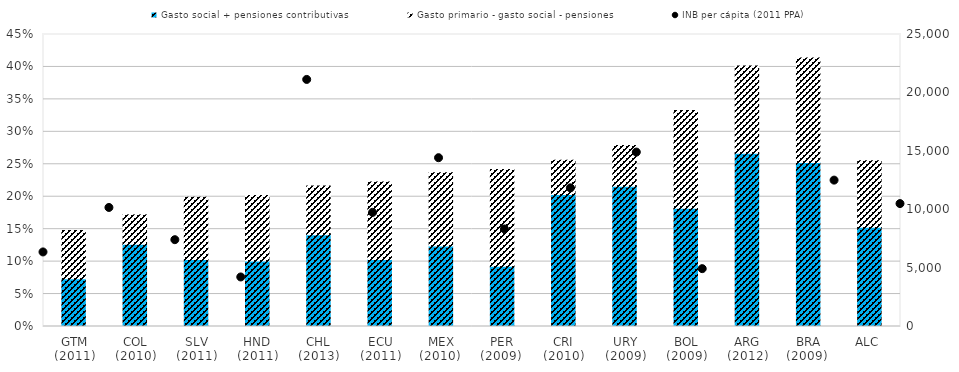
| Category | Gasto social + pensiones contributivas | Gasto primario - gasto social - pensiones |
|---|---|---|
| GTM
(2011) | 0.074 | 0.074 |
| COL
(2010) | 0.127 | 0.045 |
| SLV
(2011) | 0.103 | 0.096 |
| HND
(2011) | 0.101 | 0.101 |
| CHL
(2013) | 0.141 | 0.075 |
| ECU
(2011) | 0.103 | 0.119 |
| MEX
(2010)  | 0.124 | 0.113 |
| PER
(2009)  | 0.093 | 0.149 |
| CRI
(2010) | 0.203 | 0.053 |
| URY
(2009) | 0.216 | 0.063 |
| BOL
(2009) | 0.182 | 0.151 |
| ARG
(2012) | 0.267 | 0.134 |
| BRA
(2009)  | 0.253 | 0.161 |
| ALC | 0.153 | 0.103 |